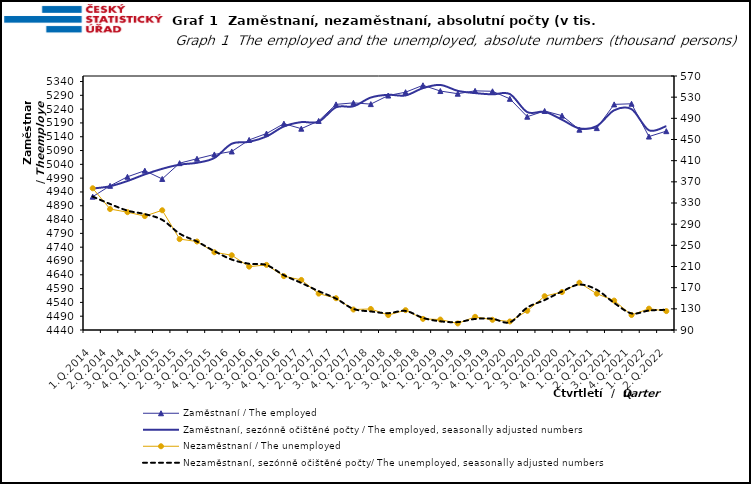
| Category | Zaměstnaní / The employed | Zaměstnaní, sezónně očištěné počty / The employed, seasonally adjusted numbers |
|---|---|---|
| 1.Q.2014 | 4922.963 | 4952.405 |
| 2.Q.2014 | 4962.219 | 4960.65 |
| 3.Q.2014 | 4994.947 | 4979.618 |
| 4.Q.2014 | 5017.051 | 5003.629 |
| 1.Q.2015 | 4987.141 | 5023.827 |
| 2.Q.2015 | 5044.285 | 5038.984 |
| 3.Q.2015 | 5060.3 | 5045.647 |
| 4.Q.2015 | 5075.884 | 5063.085 |
| 1.Q.2016 | 5086.671 | 5114.698 |
| 2.Q.2016 | 5128.493 | 5121.602 |
| 3.Q.2016 | 5151.712 | 5140.967 |
| 4.Q.2016 | 5187.436 | 5177.35 |
| 1.Q.2017 | 5169.203 | 5192.941 |
| 2.Q.2017 | 5197.265 | 5194.555 |
| 3.Q.2017 | 5257.26 | 5246.726 |
| 4.Q.2017 | 5262.691 | 5250.237 |
| 1.Q.2018 | 5258.225 | 5281.99 |
| 2.Q.2018 | 5289.242 | 5291.982 |
| 3.Q.2018 | 5301.361 | 5289.641 |
| 4.Q.2018 | 5326.327 | 5316.128 |
| 1.Q.2019 | 5305.534 | 5327.565 |
| 2.Q.2019 | 5295.929 | 5306.306 |
| 3.Q.2019 | 5306.247 | 5298.103 |
| 4.Q.2019 | 5304.7 | 5293.467 |
| 1.Q.2020 | 5277.418 | 5294.602 |
| 2.Q.2020 | 5212.593 | 5229.332 |
| 3.Q.2020 | 5233.335 | 5230.287 |
| 4.Q.2020 | 5216.403 | 5201.67 |
| 1.Q.2021 | 5165.582 | 5170.334 |
| 2.Q.2021 | 5171.264 | 5178.592 |
| 3.Q.2021 | 5257.199 | 5235.825 |
| 4.Q.2021 | 5259.43 | 5239.857 |
| 1.Q.2022 | 5140.696 | 5163.642 |
| 2.Q.2022 | 5160.173 | 5178.417 |